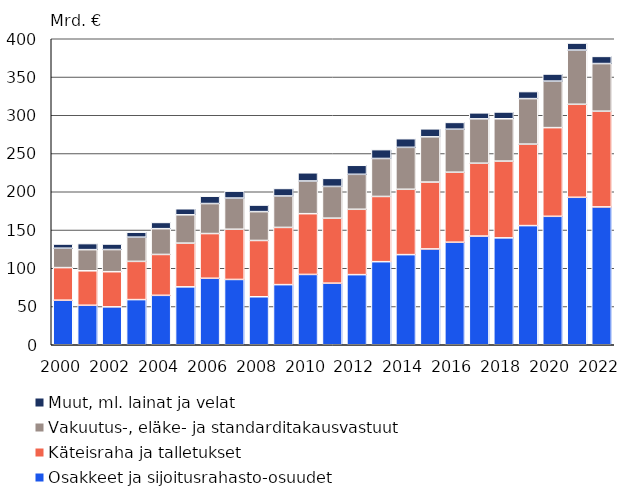
| Category | Osakkeet ja sijoitusrahasto-osuudet | Käteisraha ja talletukset | Vakuutus-, eläke- ja standarditakausvastuut         | Muut, ml. lainat ja velat |
|---|---|---|---|---|
| 2000.0 | 58.266 | 42.573 | 25.36 | 5.46 |
| 2001.0 | 51.618 | 45.069 | 27.649 | 7.907 |
| 2002.0 | 49.571 | 45.922 | 28.968 | 7.236 |
| 2003.0 | 59.026 | 49.971 | 31.663 | 6.481 |
| 2004.0 | 64.621 | 53.42 | 33.677 | 8.149 |
| 2005.0 | 75.676 | 57.148 | 37.042 | 7.902 |
| 2006.0 | 86.915 | 58.446 | 39.238 | 9.588 |
| 2007.0 | 85.372 | 65.625 | 40.738 | 9.072 |
| 2008.0 | 62.729 | 73.578 | 37.721 | 8.577 |
| 2009.0 | 78.583 | 74.795 | 41.097 | 9.798 |
| 2010.0 | 91.924 | 79.41 | 42.729 | 10.718 |
| 2011.0 | 80.487 | 84.979 | 41.506 | 10.538 |
| 2012.0 | 91.659 | 85.441 | 45.7 | 11.788 |
| 2013.0 | 108.584 | 85.28 | 49.639 | 11.548 |
| 2014.0 | 117.823 | 85.421 | 54.812 | 11.291 |
| 2015.0 | 125.278 | 87.372 | 59.129 | 10.484 |
| 2016.0 | 134.016 | 91.524 | 56.217 | 8.878 |
| 2017.0 | 142.073 | 95.232 | 57.996 | 7.854 |
| 2018.0 | 139.737 | 100.335 | 55.324 | 8.888 |
| 2019.0 | 155.747 | 106.494 | 59.495 | 9.21 |
| 2020.0 | 167.909 | 115.901 | 60.816 | 9.291 |
| 2021.0 | 192.756 | 121.598 | 70.875 | 9.14 |
| 2022.0 | 180.205 | 125.096 | 62.279 | 9.344 |